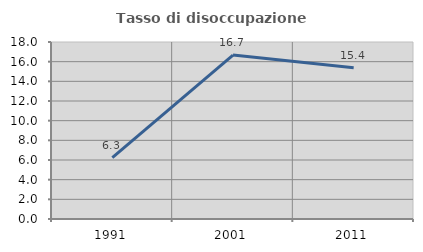
| Category | Tasso di disoccupazione giovanile  |
|---|---|
| 1991.0 | 6.25 |
| 2001.0 | 16.667 |
| 2011.0 | 15.385 |